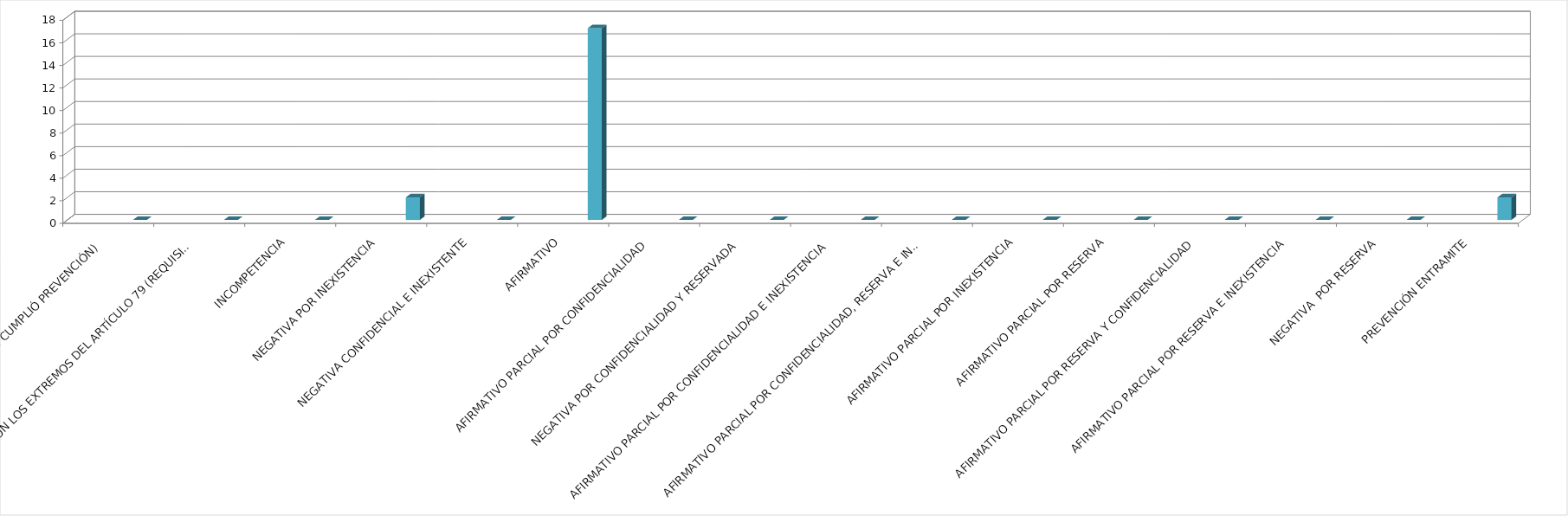
| Category | Series 0 | Series 1 | Series 2 | Series 3 | Series 4 |
|---|---|---|---|---|---|
| SE TIENE POR NO PRESENTADA ( NO CUMPLIÓ PREVENCIÓN) |  |  |  |  | 0 |
| NO CUMPLIO CON LOS EXTREMOS DEL ARTÍCULO 79 (REQUISITOS) |  |  |  |  | 0 |
| INCOMPETENCIA |  |  |  |  | 0 |
| NEGATIVA POR INEXISTENCIA |  |  |  |  | 2 |
| NEGATIVA CONFIDENCIAL E INEXISTENTE |  |  |  |  | 0 |
| AFIRMATIVO |  |  |  |  | 17 |
| AFIRMATIVO PARCIAL POR CONFIDENCIALIDAD |  |  |  |  | 0 |
| NEGATIVA POR CONFIDENCIALIDAD Y RESERVADA |  |  |  |  | 0 |
| AFIRMATIVO PARCIAL POR CONFIDENCIALIDAD E INEXISTENCIA |  |  |  |  | 0 |
| AFIRMATIVO PARCIAL POR CONFIDENCIALIDAD, RESERVA E INEXISTENCIA |  |  |  |  | 0 |
| AFIRMATIVO PARCIAL POR INEXISTENCIA |  |  |  |  | 0 |
| AFIRMATIVO PARCIAL POR RESERVA |  |  |  |  | 0 |
| AFIRMATIVO PARCIAL POR RESERVA Y CONFIDENCIALIDAD |  |  |  |  | 0 |
| AFIRMATIVO PARCIAL POR RESERVA E INEXISTENCIA |  |  |  |  | 0 |
| NEGATIVA  POR RESERVA |  |  |  |  | 0 |
| PREVENCIÓN ENTRAMITE |  |  |  |  | 2 |